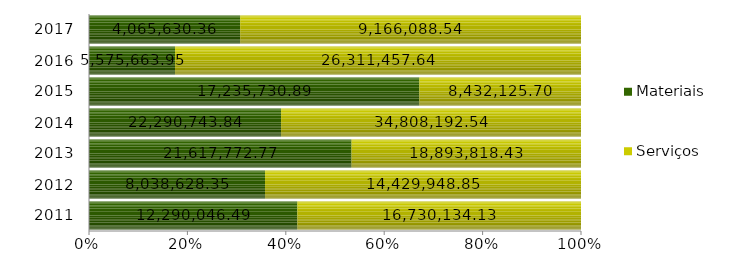
| Category | Materiais | Serviços |
|---|---|---|
| 2011.0 | 12290046.49 | 16730134.13 |
| 2012.0 | 8038628.35 | 14429948.85 |
| 2013.0 | 21617772.77 | 18893818.43 |
| 2014.0 | 22290743.84 | 34808192.54 |
| 2015.0 | 17235730.89 | 8432125.7 |
| 2016.0 | 5575663.95 | 26311457.64 |
| 2017.0 | 4065630.36 | 9166088.54 |